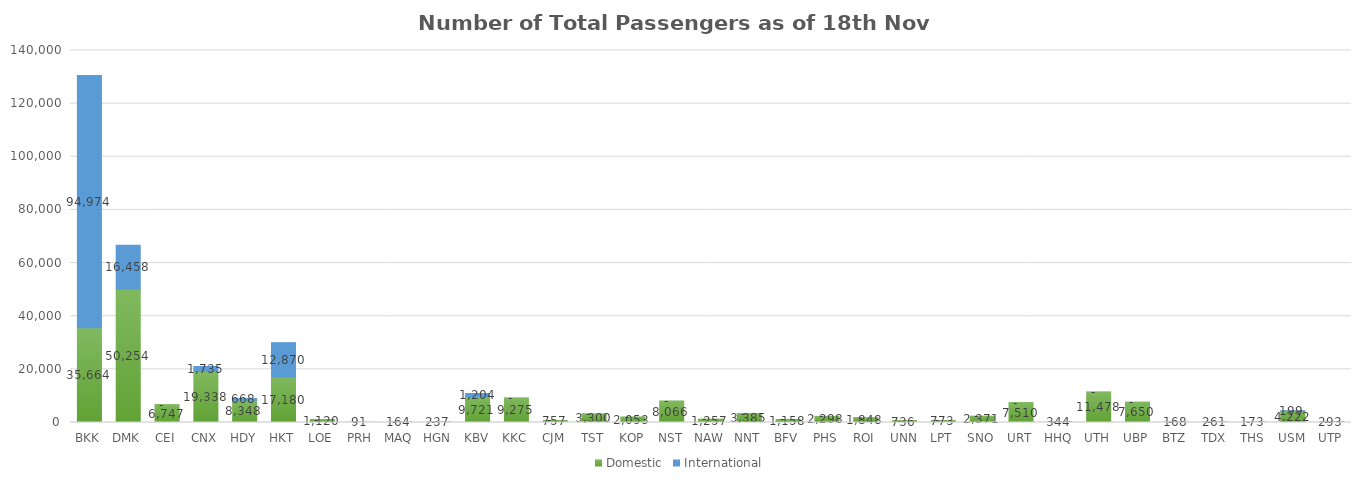
| Category | Domestic | International |
|---|---|---|
| BKK | 35664 | 94974 |
| DMK | 50254 | 16458 |
| CEI | 6747 | 0 |
| CNX | 19338 | 1735 |
| HDY | 8348 | 668 |
| HKT | 17180 | 12870 |
| LOE | 1120 | 0 |
| PRH | 91 | 0 |
| MAQ | 164 | 0 |
| HGN | 237 | 0 |
| KBV | 9721 | 1204 |
| KKC | 9275 | 0 |
| CJM | 757 | 0 |
| TST | 3300 | 0 |
| KOP | 2053 | 0 |
| NST | 8066 | 0 |
| NAW | 1257 | 0 |
| NNT | 3385 | 0 |
| BFV | 1158 | 0 |
| PHS | 2298 | 0 |
| ROI | 1848 | 0 |
| UNN | 736 | 0 |
| LPT | 773 | 0 |
| SNO | 2371 | 0 |
| URT | 7510 | 0 |
| HHQ | 344 | 0 |
| UTH | 11478 | 0 |
| UBP | 7650 | 0 |
| BTZ | 168 | 0 |
| TDX | 261 | 0 |
| THS | 173 | 0 |
| USM | 4222 | 199 |
| UTP | 293 | 0 |